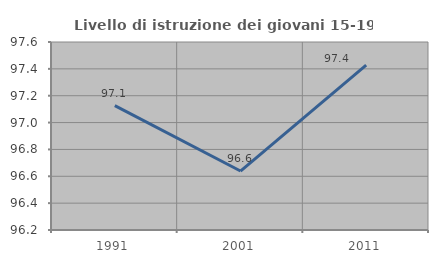
| Category | Livello di istruzione dei giovani 15-19 anni |
|---|---|
| 1991.0 | 97.127 |
| 2001.0 | 96.639 |
| 2011.0 | 97.427 |